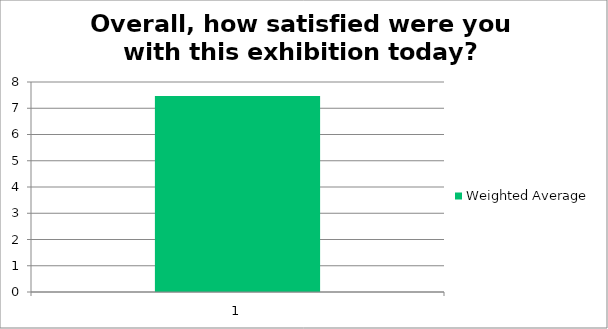
| Category | Weighted Average |
|---|---|
| 1.0 | 7.47 |